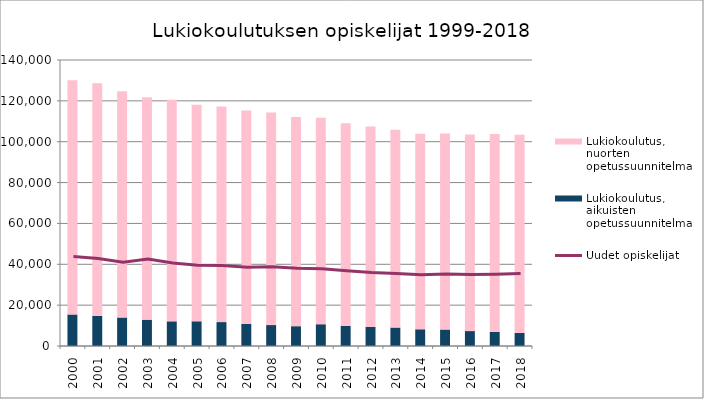
| Category | Lukiokoulutus, aikuisten opetussuunnitelma | Lukiokoulutus, nuorten opetussuunnitelma |
|---|---|---|
| 2000.0 | 15445 | 114587 |
| 2001.0 | 14755 | 113887 |
| 2002.0 | 13951 | 110693 |
| 2003.0 | 12892 | 108924 |
| 2004.0 | 12068 | 108463 |
| 2005.0 | 12091 | 106020 |
| 2006.0 | 11688 | 105572 |
| 2007.0 | 10885 | 104368 |
| 2008.0 | 10230 | 104010 |
| 2009.0 | 9713 | 102375 |
| 2010.0 | 10661 | 101117 |
| 2011.0 | 9778 | 99268 |
| 2012.0 | 9357 | 98055 |
| 2013.0 | 9043 | 96855 |
| 2014.0 | 8182 | 95732 |
| 2015.0 | 8066 | 95994 |
| 2016.0 | 7282 | 96268 |
| 2017.0 | 6915 | 96838 |
| 2018.0 | 6393 | 97047 |